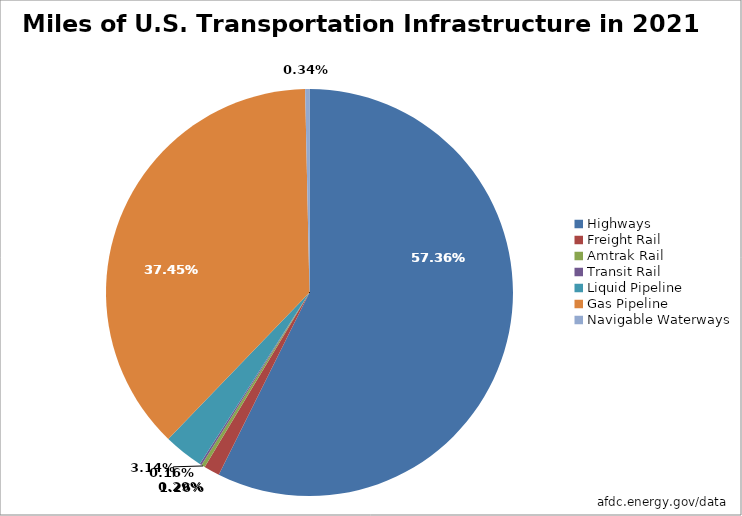
| Category | Series 0 |
|---|---|
| Highways | 4187440 |
| Freight Rail | 91651 |
| Amtrak Rail | 21124 |
| Transit Rail | 11730 |
| Liquid Pipeline | 229374 |
| Gas Pipeline | 2734240 |
| Navigable Waterways | 25000 |